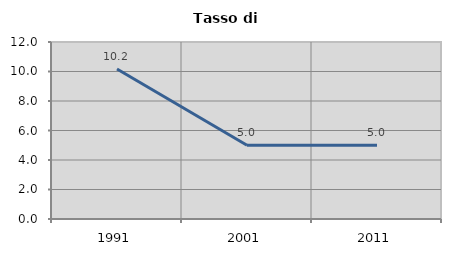
| Category | Tasso di disoccupazione   |
|---|---|
| 1991.0 | 10.169 |
| 2001.0 | 5 |
| 2011.0 | 5 |